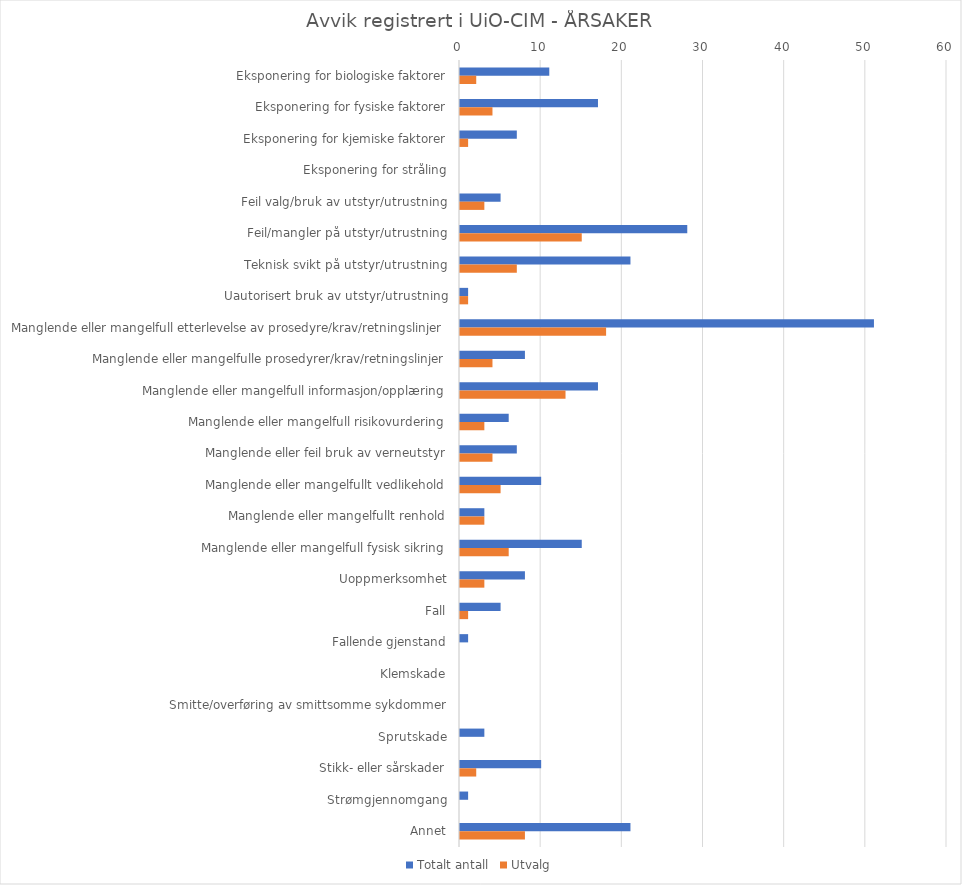
| Category | Totalt antall | Utvalg |
|---|---|---|
| Eksponering for biologiske faktorer | 11 | 2 |
| Eksponering for fysiske faktorer | 17 | 4 |
| Eksponering for kjemiske faktorer | 7 | 1 |
| Eksponering for stråling | 0 | 0 |
| Feil valg/bruk av utstyr/utrustning | 5 | 3 |
| Feil/mangler på utstyr/utrustning | 28 | 15 |
| Teknisk svikt på utstyr/utrustning | 21 | 7 |
| Uautorisert bruk av utstyr/utrustning | 1 | 1 |
| Manglende eller mangelfull etterlevelse av prosedyre/krav/retningslinjer | 51 | 18 |
| Manglende eller mangelfulle prosedyrer/krav/retningslinjer | 8 | 4 |
| Manglende eller mangelfull informasjon/opplæring | 17 | 13 |
| Manglende eller mangelfull risikovurdering | 6 | 3 |
| Manglende eller feil bruk av verneutstyr | 7 | 4 |
| Manglende eller mangelfullt vedlikehold | 10 | 5 |
| Manglende eller mangelfullt renhold | 3 | 3 |
| Manglende eller mangelfull fysisk sikring | 15 | 6 |
| Uoppmerksomhet | 8 | 3 |
| Fall | 5 | 1 |
| Fallende gjenstand | 1 | 0 |
| Klemskade | 0 | 0 |
| Smitte/overføring av smittsomme sykdommer | 0 | 0 |
| Sprutskade | 3 | 0 |
| Stikk- eller sårskader | 10 | 2 |
| Strømgjennomgang | 1 | 0 |
| Annet | 21 | 8 |